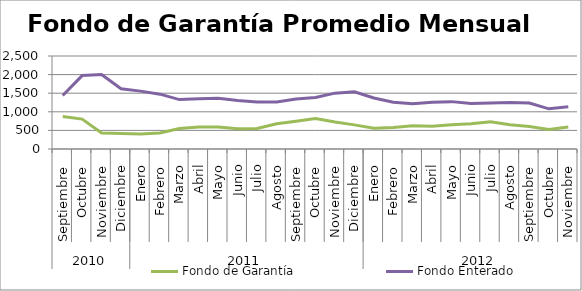
| Category | Fondo de Garantía | Fondo Enterado |
|---|---|---|
| 0 | 871.43 | 1439.553 |
| 1 | 804.208 | 1973.732 |
| 2 | 428.758 | 2004.096 |
| 3 | 417.974 | 1620.905 |
| 4 | 403.651 | 1555.632 |
| 5 | 429.02 | 1474.054 |
| 6 | 551.344 | 1328.521 |
| 7 | 591.732 | 1351.463 |
| 8 | 591.784 | 1363.301 |
| 9 | 544.875 | 1304.985 |
| 10 | 551.606 | 1265.502 |
| 11 | 679.839 | 1266.018 |
| 12 | 747.74 | 1344.929 |
| 13 | 819.75 | 1383.171 |
| 14 | 723.635 | 1501.378 |
| 15 | 648.288 | 1537.485 |
| 16 | 560.173 | 1370.992 |
| 17 | 575.916 | 1258.831 |
| 18 | 622.075 | 1216.471 |
| 19 | 612.299 | 1258.963 |
| 20 | 654.277 | 1273.362 |
| 21 | 675.965 | 1225.977 |
| 22 | 729.97 | 1235.91 |
| 23 | 649.095 | 1253.333 |
| 24 | 606.03 | 1237.548 |
| 25 | 525.314 | 1079.857 |
| 26 | 591.646 | 1134.772 |